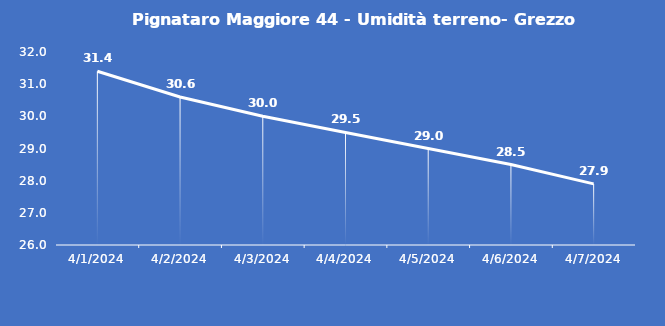
| Category | Pignataro Maggiore 44 - Umidità terreno- Grezzo (%VWC) |
|---|---|
| 4/1/24 | 31.4 |
| 4/2/24 | 30.6 |
| 4/3/24 | 30 |
| 4/4/24 | 29.5 |
| 4/5/24 | 29 |
| 4/6/24 | 28.5 |
| 4/7/24 | 27.9 |